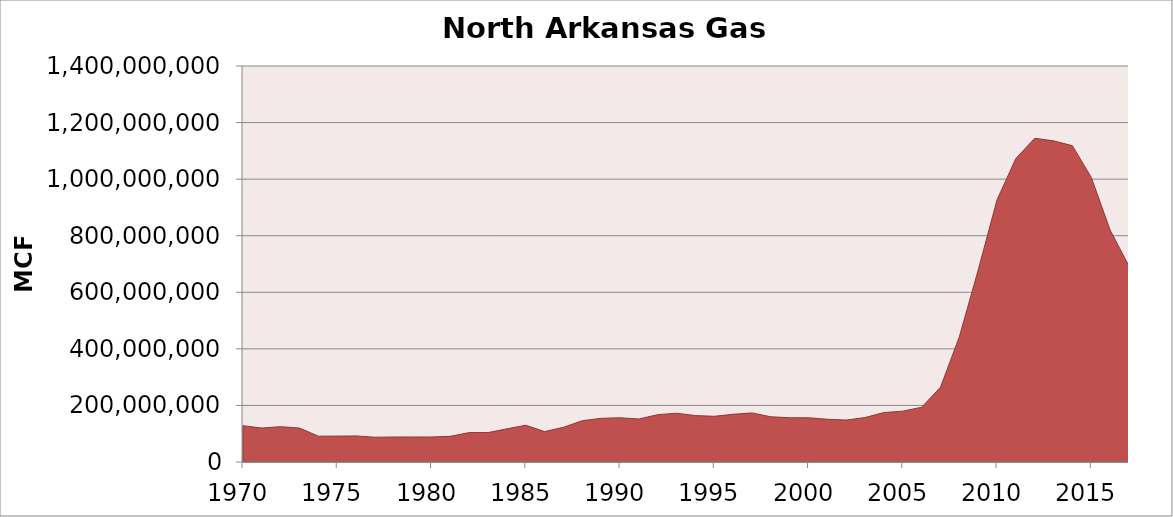
| Category | North Arkansas Gas Production |
|---|---|
| 1970.0 | 128217417 |
| 1971.0 | 120072280 |
| 1972.0 | 124957885 |
| 1973.0 | 119960188 |
| 1974.0 | 91437937 |
| 1975.0 | 91541138 |
| 1976.0 | 92202126 |
| 1977.0 | 87628447 |
| 1978.0 | 88422783 |
| 1979.0 | 88423586 |
| 1980.0 | 88426939 |
| 1981.0 | 90906415 |
| 1982.0 | 103999850 |
| 1983.0 | 104134487 |
| 1984.0 | 117115662 |
| 1985.0 | 130096313 |
| 1986.0 | 107553561 |
| 1987.0 | 122720190 |
| 1988.0 | 146139998 |
| 1989.0 | 154476132 |
| 1990.0 | 156298888 |
| 1991.0 | 152073674 |
| 1992.0 | 167409332 |
| 1993.0 | 172419092 |
| 1994.0 | 164116114 |
| 1995.0 | 161525558 |
| 1996.0 | 168802054 |
| 1997.0 | 173496974 |
| 1998.0 | 159897237 |
| 1999.0 | 156432684 |
| 2000.0 | 156345720 |
| 2001.0 | 151180284 |
| 2002.0 | 148173472 |
| 2003.0 | 157309603 |
| 2004.0 | 174895593 |
| 2005.0 | 179789543 |
| 2006.0 | 193537895 |
| 2007.0 | 264375927 |
| 2008.0 | 442587341 |
| 2009.0 | 678660167 |
| 2010.0 | 926990044 |
| 2011.0 | 1073348967 |
| 2012.0 | 1144522682 |
| 2013.0 | 1135308109 |
| 2014.0 | 1118279314 |
| 2015.0 | 1006042203 |
| 2016.0 | 819853528 |
| 2017.0 | 692460188 |